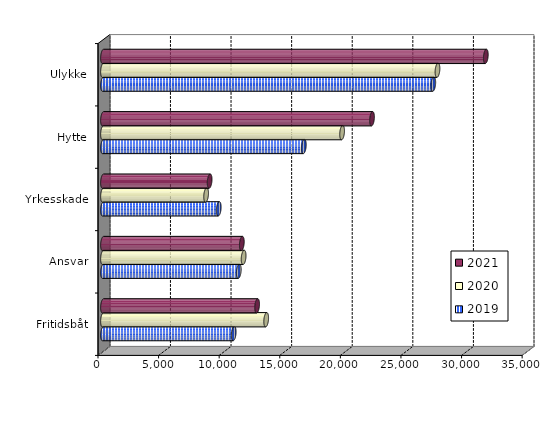
| Category | 2019 | 2020 | 2021 |
|---|---|---|---|
| Fritidsbåt | 10785.192 | 13466 | 12717.946 |
| Ansvar | 11204.776 | 11603.98 | 11455.784 |
| Yrkesskade | 9550.428 | 8509.779 | 8798.661 |
| Hytte | 16571.543 | 19730 | 22199 |
| Ulykke | 27254.8 | 27600.997 | 31589.073 |